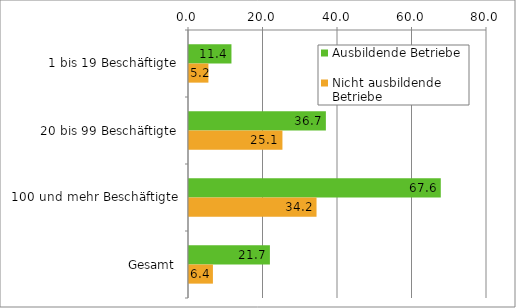
| Category | Ausbildende Betriebe  | Nicht ausbildende Betriebe |
|---|---|---|
|  1 bis 19 Beschäftigte | 11.397 | 5.21 |
| 20 bis 99 Beschäftigte | 36.746 | 25.083 |
| 100 und mehr Beschäftigte | 67.595 | 34.238 |
| Gesamt | 21.718 | 6.422 |